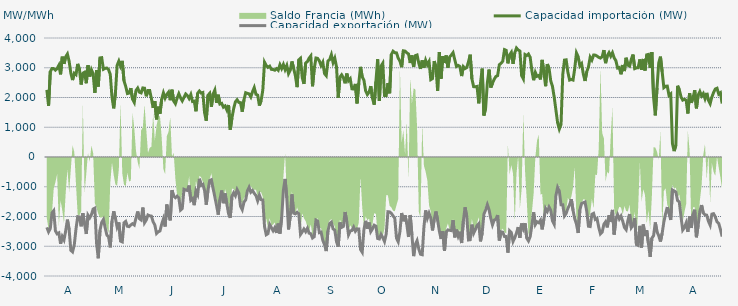
| Category | Capacidad importación (MW) | Capacidad exportación (MW) |
|---|---|---|
| 0 | 2256.625 | -2365.667 |
| 1900-01-01 | 1722.917 | -2515.917 |
| 1900-01-02 | 2869 | -2405.667 |
| 1900-01-03 | 2973.167 | -1879.167 |
| 1900-01-04 | 2971 | -1806.25 |
| 1900-01-05 | 2919.208 | -2484.833 |
| 1900-01-06 | 2973.125 | -2583.917 |
| 1900-01-07 | 3083.25 | -2551.375 |
| 1900-01-08 | 2777.875 | -2917.292 |
| 1900-01-09 | 3371.833 | -2672.292 |
| 1900-01-10 | 3131 | -2785.25 |
| 1900-01-11 | 3368.375 | -2480.958 |
| 1900-01-12 | 3462.292 | -2105.333 |
| 1900-01-13 | 3215.917 | -2442.958 |
| 1900-01-14 | 2817.875 | -3136.917 |
| 1900-01-15 | 2586 | -3188.792 |
| 1900-01-16 | 2815 | -2954.042 |
| 1900-01-17 | 2767 | -2418.75 |
| 1900-01-18 | 3129.208 | -2005 |
| 1900-01-19 | 2953.792 | -2013.417 |
| 1900-01-20 | 2437.083 | -2329.833 |
| 1900-01-21 | 2815.958 | -1889.333 |
| 1900-01-22 | 2849.708 | -2257.667 |
| 1900-01-23 | 2479.208 | -2586.833 |
| 1900-01-24 | 3084.333 | -1954.5 |
| 1900-01-25 | 2707.042 | -2046.583 |
| 1900-01-26 | 2933.542 | -1941.667 |
| 1900-01-27 | 2795.917 | -1750 |
| 1900-01-28 | 2158.042 | -1718.75 |
| 1900-01-29 | 2918.875 | -2898.083 |
| 1900-01-30 | 2368.375 | -3404.167 |
| 1900-01-31 | 3329.75 | -2465.083 |
| 1900-02-01 | 3339.208 | -2197.25 |
| 1900-02-02 | 2948.5 | -2100.583 |
| 1900-02-03 | 2980.792 | -2371.042 |
| 1900-02-04 | 2990.708 | -2620.708 |
| 1900-02-05 | 2938.333 | -2683 |
| 1900-02-06 | 2774.542 | -3036.75 |
| 1900-02-07 | 2014.917 | -2156.292 |
| 1900-02-08 | 1635.417 | -1825.292 |
| 1900-02-09 | 2140.25 | -2060.75 |
| 1900-02-10 | 3080.917 | -2353.125 |
| 1900-02-11 | 3223.333 | -2199.083 |
| 1900-02-12 | 3058.083 | -2827.667 |
| 1900-02-13 | 3231.167 | -2853.292 |
| 1900-02-14 | 2562 | -2213.625 |
| 1900-02-15 | 2375 | -2164.25 |
| 1900-02-16 | 2133.333 | -2329.5 |
| 1900-02-17 | 2150 | -2341.083 |
| 1900-02-18 | 2314.583 | -2282 |
| 1900-02-19 | 1943.75 | -2242.25 |
| 1900-02-20 | 1835.625 | -2285.208 |
| 1900-02-21 | 2235.417 | -2055.542 |
| 1900-02-22 | 2316.667 | -1831.25 |
| 1900-02-23 | 2178.125 | -2071.583 |
| 1900-02-24 | 2154.167 | -2116.125 |
| 1900-02-25 | 2321.417 | -1699.458 |
| 1900-02-26 | 2312 | -2210.167 |
| 1900-02-27 | 2040.917 | -2118.083 |
| 1900-02-28 | 2233.083 | -1949.458 |
| 1900-02-28 | 2234.854 | -1977.083 |
| 1900-03-01 | 1964.583 | -1985.792 |
| 1900-03-02 | 1650 | -2177.417 |
| 1900-03-03 | 1877.083 | -2287.667 |
| 1900-03-04 | 1264.583 | -2568.708 |
| 1900-03-05 | 1691.667 | -2512.667 |
| 1900-03-06 | 1456.25 | -2486.333 |
| 1900-03-07 | 1945.833 | -2259.083 |
| 1900-03-08 | 2154.167 | -2079.5 |
| 1900-03-09 | 1979.167 | -2336.083 |
| 1900-03-10 | 2104.167 | -1597.917 |
| 1900-03-11 | 2179.167 | -1954.167 |
| 1900-03-12 | 1908.333 | -2131.25 |
| 1900-03-13 | 2262.5 | -1118.75 |
| 1900-03-14 | 1879.167 | -1314.583 |
| 1900-03-15 | 1791.667 | -1368 |
| 1900-03-16 | 1977.083 | -1316.667 |
| 1900-03-17 | 2127.083 | -1377.083 |
| 1900-03-18 | 1987.5 | -1785.417 |
| 1900-03-19 | 1887.5 | -1733.333 |
| 1900-03-20 | 2002.083 | -1085.417 |
| 1900-03-21 | 2118.75 | -1110.417 |
| 1900-03-22 | 2066.667 | -1125 |
| 1900-03-23 | 1966.667 | -958.333 |
| 1900-03-24 | 2097.917 | -1454.167 |
| 1900-03-25 | 1864.583 | -1397.917 |
| 1900-03-26 | 1877.083 | -1618.75 |
| 1900-03-27 | 1537.5 | -1143.75 |
| 1900-03-28 | 2145.833 | -1264 |
| 1900-03-29 | 2216.667 | -731.25 |
| 1900-03-30 | 2150 | -950 |
| 1900-03-31 | 2167.583 | -916.667 |
| 1900-04-01 | 1493.75 | -1122.25 |
| 1900-04-02 | 1220.833 | -1604.167 |
| 1900-04-03 | 2072.917 | -1125 |
| 1900-04-04 | 2139.583 | -791.667 |
| 1900-04-05 | 1687.5 | -764.583 |
| 1900-04-06 | 2116.667 | -1058.333 |
| 1900-04-07 | 2247.917 | -1337.5 |
| 1900-04-08 | 1818.75 | -1627.083 |
| 1900-04-09 | 2093.75 | -1937.5 |
| 1900-04-10 | 1781.25 | -1422.917 |
| 1900-04-11 | 1804.167 | -1127.083 |
| 1900-04-12 | 1675 | -1552.083 |
| 1900-04-13 | 1716.667 | -1225 |
| 1900-04-14 | 1583.333 | -1570.833 |
| 1900-04-15 | 1747.917 | -1904.167 |
| 1900-04-16 | 918.75 | -2042.875 |
| 1900-04-17 | 1314.583 | -1310.417 |
| 1900-04-18 | 1629.167 | -1200 |
| 1900-04-19 | 1852.083 | -1300.583 |
| 1900-04-20 | 1925 | -1095.833 |
| 1900-04-21 | 1835.417 | -1208.333 |
| 1900-04-22 | 1827.083 | -1656.25 |
| 1900-04-23 | 1522.917 | -1770.917 |
| 1900-04-24 | 1916.667 | -1518.75 |
| 1900-04-25 | 2160.417 | -1441.667 |
| 1900-04-26 | 2139.583 | -1137.5 |
| 1900-04-27 | 2120.833 | -1018.75 |
| 1900-04-28 | 2018.75 | -1183.333 |
| 1900-04-29 | 2193.75 | -1127.083 |
| 1900-04-30 | 2333.333 | -1220.833 |
| 1900-05-01 | 2108.333 | -1295.833 |
| 1900-05-02 | 2079.833 | -1472.917 |
| 1900-05-03 | 1729.167 | -1281.25 |
| 1900-05-04 | 1897.917 | -1434.542 |
| 1900-05-05 | 2247 | -1443.75 |
| 1900-05-06 | 3185.083 | -2337 |
| 1900-05-07 | 3075.167 | -2613.625 |
| 1900-05-08 | 3013.625 | -2576.5 |
| 1900-05-09 | 3052.042 | -2269.25 |
| 1900-05-10 | 2946.333 | -2370.833 |
| 1900-05-11 | 2940.542 | -2478.958 |
| 1900-05-12 | 2917.208 | -2375.625 |
| 1900-05-13 | 2971.167 | -2551.875 |
| 1900-05-14 | 2917.292 | -2238 |
| 1900-05-15 | 3101.958 | -2573.167 |
| 1900-05-16 | 2973.375 | -2041.667 |
| 1900-05-17 | 3109.875 | -1120.167 |
| 1900-05-18 | 2936.333 | -737.5 |
| 1900-05-19 | 3074.833 | -1371.667 |
| 1900-05-20 | 2802.417 | -2434.917 |
| 1900-05-21 | 2913.625 | -1996.875 |
| 1900-05-22 | 3212.125 | -1254.167 |
| 1900-05-23 | 2973 | -1887.5 |
| 1900-05-24 | 2732 | -1910.417 |
| 1900-05-25 | 2348.333 | -1858 |
| 1900-05-26 | 3266 | -1911.25 |
| 1900-05-27 | 3318.417 | -2603.917 |
| 1900-05-28 | 2666.292 | -2519.292 |
| 1900-05-29 | 2457.667 | -2420.375 |
| 1900-05-30 | 3159.917 | -2510.583 |
| 1900-05-31 | 3208.208 | -2395.833 |
| 1900-06-01 | 3322.042 | -2559.25 |
| 1900-06-02 | 3397.292 | -2579.208 |
| 1900-06-03 | 2377.292 | -2722 |
| 1900-06-04 | 2966.875 | -2678.583 |
| 1900-06-05 | 3327.583 | -2120.833 |
| 1900-06-06 | 3314.125 | -2154.167 |
| 1900-06-07 | 3229.625 | -2542.417 |
| 1900-06-08 | 3075.125 | -2524.125 |
| 1900-06-09 | 3186.833 | -2800.875 |
| 1900-06-10 | 2804.417 | -2944.208 |
| 1900-06-11 | 2733.75 | -3162.5 |
| 1900-06-12 | 3225.458 | -2491.042 |
| 1900-06-13 | 3275.667 | -2238.417 |
| 1900-06-14 | 3439.5 | -2190.417 |
| 1900-06-15 | 3175.292 | -2417.375 |
| 1900-06-16 | 3321.875 | -2458.417 |
| 1900-06-17 | 3034.917 | -2846.167 |
| 1900-06-18 | 1991.917 | -3010.667 |
| 1900-06-19 | 2685.833 | -2200.25 |
| 1900-06-20 | 2763.167 | -2365.208 |
| 1900-06-21 | 2664.875 | -2334.375 |
| 1900-06-22 | 2477.792 | -1849.417 |
| 1900-06-23 | 2804.25 | -2175.083 |
| 1900-06-24 | 2563.458 | -2614.833 |
| 1900-06-25 | 2629.917 | -2484.333 |
| 1900-06-26 | 2292 | -2469.792 |
| 1900-06-27 | 2284.542 | -2356.917 |
| 1900-06-28 | 2456.5 | -2494.792 |
| 1900-06-29 | 1801.792 | -2413.833 |
| 1900-06-30 | 2484.917 | -2419 |
| 1900-07-01 | 3029.417 | -3108.292 |
| 1900-07-02 | 2693.417 | -3201.125 |
| 1900-07-03 | 2579.5 | -2439 |
| 1900-07-04 | 2220.833 | -2146.167 |
| 1900-07-05 | 2100 | -2410.292 |
| 1900-07-06 | 2179.167 | -2202.083 |
| 1900-07-07 | 2381.25 | -2508.5 |
| 1900-07-08 | 1970.833 | -2414.375 |
| 1900-07-09 | 1758.333 | -2292.792 |
| 1900-07-10 | 2544 | -2324.083 |
| 1900-07-11 | 3285.125 | -2739.75 |
| 1900-07-12 | 1885.375 | -2754.917 |
| 1900-07-13 | 3057.958 | -2601 |
| 1900-07-14 | 3152.583 | -2708.375 |
| 1900-07-15 | 2068.833 | -2840.833 |
| 1900-07-16 | 2060.917 | -2586.417 |
| 1900-07-17 | 2484.25 | -1839.417 |
| 1900-07-18 | 2141.208 | -1845.833 |
| 1900-07-19 | 3445.375 | -1893.75 |
| 1900-07-20 | 3555.25 | -1979.583 |
| 1900-07-21 | 3506.875 | -2054.167 |
| 1900-07-22 | 3499.292 | -2730 |
| 1900-07-23 | 3321.917 | -2848.375 |
| 1900-07-24 | 3225.583 | -2505.583 |
| 1900-07-25 | 3019.583 | -1882.958 |
| 1900-07-26 | 3568.667 | -2157.833 |
| 1900-07-27 | 3559.375 | -1957.75 |
| 1900-07-28 | 3503.125 | -2252.375 |
| 1900-07-29 | 3464.458 | -2689.458 |
| 1900-07-30 | 3159.52 | -1949.52 |
| 1900-07-31 | 3414.875 | -2624.75 |
| 1900-08-01 | 3028.417 | -3331.875 |
| 1900-08-02 | 3406.833 | -2936.5 |
| 1900-08-03 | 3428.875 | -2811.25 |
| 1900-08-04 | 3154.208 | -3088.625 |
| 1900-08-05 | 2961.542 | -3268.083 |
| 1900-08-06 | 3246.75 | -3285.125 |
| 1900-08-07 | 2998.792 | -2359.333 |
| 1900-08-08 | 3250.625 | -1795.833 |
| 1900-08-09 | 3098.083 | -2058.458 |
| 1900-08-10 | 3208.458 | -1889.583 |
| 1900-08-11 | 2600.833 | -2050 |
| 1900-08-12 | 2636.458 | -2468.208 |
| 1900-08-13 | 3221.75 | -2100 |
| 1900-08-14 | 3030.917 | -1831.25 |
| 1900-08-15 | 2221.417 | -2127.083 |
| 1900-08-16 | 3529.833 | -2490.5 |
| 1900-08-17 | 2631.583 | -2756.25 |
| 1900-08-18 | 3389.417 | -2493.667 |
| 1900-08-19 | 3161.917 | -3158.375 |
| 1900-08-20 | 3412.417 | -2518.792 |
| 1900-08-21 | 3004.917 | -2450.333 |
| 1900-08-22 | 3360.75 | -2463.25 |
| 1900-08-23 | 3427.958 | -2474.292 |
| 1900-08-24 | 3506.917 | -2123.5 |
| 1900-08-25 | 3269.708 | -2701.708 |
| 1900-08-26 | 3043.333 | -2440.417 |
| 1900-08-27 | 3078.833 | -2660.667 |
| 1900-08-28 | 3042.542 | -2510.25 |
| 1900-08-29 | 2720.083 | -2892.208 |
| 1900-08-30 | 3035.792 | -2156.833 |
| 1900-08-31 | 2973.125 | -1691.667 |
| 1900-09-01 | 3008.708 | -2006.25 |
| 1900-09-02 | 3198.417 | -2788.271 |
| 1900-09-03 | 3439.5 | -2780.875 |
| 1900-09-04 | 2626.625 | -2273 |
| 1900-09-05 | 2364.583 | -2564.167 |
| 1900-09-06 | 2360.417 | -2440.708 |
| 1900-09-07 | 2372.917 | -2302.125 |
| 1900-09-08 | 1804.167 | -2241.25 |
| 1900-09-09 | 2476.875 | -2836.292 |
| 1900-09-10 | 2972.208 | -2552.292 |
| 1900-09-11 | 1394.917 | -1922 |
| 1900-09-12 | 1635.417 | -1780.667 |
| 1900-09-13 | 2487.208 | -1602.083 |
| 1900-09-14 | 2938.333 | -1770.833 |
| 1900-09-15 | 2333.708 | -2058.75 |
| 1900-09-16 | 2480.333 | -2280.5 |
| 1900-09-17 | 2612.458 | -2120.333 |
| 1900-09-18 | 2705.792 | -2095.25 |
| 1900-09-19 | 2735.375 | -1951.833 |
| 1900-09-20 | 3100.375 | -2807.583 |
| 1900-09-21 | 3154.125 | -2514.417 |
| 1900-09-22 | 3216.042 | -2530.208 |
| 1900-09-23 | 3609.167 | -2672.875 |
| 1900-09-24 | 3585.958 | -2674.5 |
| 1900-09-25 | 3148.417 | -3214.25 |
| 1900-09-26 | 3433.542 | -2480.667 |
| 1900-09-27 | 3518.5 | -2539.5 |
| 1900-09-28 | 3130.292 | -2838.583 |
| 1900-09-29 | 3499.167 | -2718.417 |
| 1900-09-30 | 3663.042 | -2554.083 |
| 1900-10-01 | 3596.708 | -2355.75 |
| 1900-10-02 | 3562.792 | -2716.417 |
| 1900-10-03 | 2738.75 | -2235.333 |
| 1900-10-04 | 2625.667 | -2410 |
| 1900-10-05 | 3444.083 | -2226.333 |
| 1900-10-06 | 3408.75 | -2728 |
| 1900-10-07 | 3460.583 | -2820.25 |
| 1900-10-08 | 3350.75 | -2676.083 |
| 1900-10-09 | 2899.917 | -2289.583 |
| 1900-10-10 | 2581.708 | -1858.083 |
| 1900-10-11 | 2842.042 | -2272.417 |
| 1900-10-12 | 2711.125 | -2177.417 |
| 1900-10-13 | 2740.458 | -2209.667 |
| 1900-10-14 | 2608.583 | -2127.083 |
| 1900-10-15 | 3264.042 | -2433.083 |
| 1900-10-16 | 2836.375 | -2085.417 |
| 1900-10-17 | 2379.792 | -1727.083 |
| 1900-10-18 | 3123.25 | -1827.083 |
| 1900-10-19 | 2982.792 | -1681.25 |
| 1900-10-20 | 2556.667 | -1789.667 |
| 1900-10-21 | 2375.667 | -2149.333 |
| 1900-10-22 | 2017.208 | -2261.458 |
| 1900-10-23 | 1585 | -1297.917 |
| 1900-10-24 | 1154.167 | -1022.917 |
| 1900-10-25 | 939.583 | -1143.75 |
| 1900-10-26 | 1093.75 | -1604.167 |
| 1900-10-27 | 2763.333 | -1604.167 |
| 1900-10-28 | 3256.375 | -1980.875 |
| 1900-10-29 | 3265.958 | -1897.917 |
| 1900-10-30 | 2849.625 | -1726.333 |
| 1900-10-31 | 2586.542 | -1614.583 |
| 1900-11-01 | 2607.375 | -1416.667 |
| 1900-11-02 | 2587.208 | -1789.583 |
| 1900-11-03 | 2978.5 | -2081.25 |
| 1900-11-04 | 3497.083 | -2256.292 |
| 1900-11-05 | 3370 | -2554.542 |
| 1900-11-06 | 3061.75 | -1771.917 |
| 1900-11-07 | 3134.875 | -1562.5 |
| 1900-11-08 | 2789.5 | -1537.5 |
| 1900-11-09 | 2555.75 | -1512.5 |
| 1900-11-10 | 2867.083 | -1825 |
| 1900-11-11 | 3026.833 | -2326.458 |
| 1900-11-12 | 3354.833 | -2337.292 |
| 1900-11-13 | 3258.292 | -1924.167 |
| 1900-11-14 | 3426.125 | -1893.75 |
| 1900-11-15 | 3424.167 | -2100 |
| 1900-11-16 | 3391.208 | -2070.833 |
| 1900-11-17 | 3348.208 | -2362.208 |
| 1900-11-18 | 3325.958 | -2584.917 |
| 1900-11-19 | 3372.292 | -2526.125 |
| 1900-11-20 | 3594.458 | -2261.833 |
| 1900-11-21 | 3154.208 | -2177.542 |
| 1900-11-22 | 3406.542 | -2366 |
| 1900-11-23 | 3506.792 | -1962 |
| 1900-11-24 | 3388.292 | -2170.833 |
| 1900-11-25 | 3502.625 | -1778.917 |
| 1900-11-26 | 3329.875 | -2606.583 |
| 1900-11-27 | 3238.958 | -2081.917 |
| 1900-11-28 | 2990.542 | -1937.25 |
| 1900-11-29 | 3009.542 | -2084.208 |
| 1900-11-30 | 2780.333 | -1987.25 |
| 1900-12-01 | 3090.792 | -2157.25 |
| 1900-12-02 | 2889.375 | -2369.167 |
| 1900-12-03 | 3335.375 | -2443.917 |
| 1900-12-04 | 3086.625 | -2135.417 |
| 1900-12-05 | 3054 | -1916.417 |
| 1900-12-06 | 3285.417 | -2373 |
| 1900-12-07 | 3443.292 | -2289.333 |
| 1900-12-08 | 2971.208 | -2047.917 |
| 1900-12-09 | 2996.292 | -2944.458 |
| 1900-12-10 | 3001.167 | -2971.542 |
| 1900-12-11 | 3281.375 | -2314.833 |
| 1900-12-12 | 2936.042 | -3043.167 |
| 1900-12-13 | 3294.792 | -2270.333 |
| 1900-12-14 | 2907.375 | -2657.667 |
| 1900-12-15 | 3433.583 | -2462.5 |
| 1900-12-16 | 3449.042 | -2914.583 |
| 1900-12-17 | 2992.458 | -3358.458 |
| 1900-12-18 | 3524.375 | -2728.208 |
| 1900-12-19 | 2000 | -2643.375 |
| 1900-12-20 | 1400 | -2200 |
| 1900-12-21 | 2323.375 | -2514.75 |
| 1900-12-22 | 3160.167 | -2645.333 |
| 1900-12-23 | 3372.083 | -2842.167 |
| 1900-12-24 | 2865.739 | -2564.565 |
| 1900-12-25 | 2332.667 | -2181.833 |
| 1900-12-26 | 2376.083 | -1906.25 |
| 1900-12-27 | 2381.25 | -1683.333 |
| 1900-12-28 | 2070.833 | -1891.667 |
| 1900-12-29 | 2120.083 | -2118.75 |
| 1900-12-30 | 449.25 | -1108.333 |
| 1900-12-31 | 200 | -1139.583 |
| 1901-01-01 | 395.833 | -1179.167 |
| 1901-01-02 | 2393.75 | -1462.5 |
| 1901-01-03 | 2262.25 | -1512.5 |
| 1901-01-04 | 2020.833 | -2007.167 |
| 1901-01-05 | 1912.5 | -2455.208 |
| 1901-01-06 | 1939.583 | -2371.125 |
| 1901-01-07 | 1908.333 | -2217.958 |
| 1901-01-08 | 1462.5 | -2517.542 |
| 1901-01-09 | 2145.208 | -2000.417 |
| 1901-01-10 | 1820.833 | -2386.167 |
| 1901-01-11 | 1983.333 | -1930.75 |
| 1901-01-12 | 2245.833 | -1772.917 |
| 1901-01-13 | 1635.417 | -2697.5 |
| 1901-01-14 | 2079.167 | -2299.625 |
| 1901-01-15 | 2200 | -1818.75 |
| 1901-01-16 | 2052.083 | -1616.667 |
| 1901-01-17 | 2133.333 | -1885.417 |
| 1901-01-18 | 1962.5 | -1940.792 |
| 1901-01-19 | 2154.167 | -1955.875 |
| 1901-01-20 | 1906.25 | -2160.458 |
| 1901-01-21 | 1791.667 | -2289.583 |
| 1901-01-22 | 2014.583 | -1920.333 |
| 1901-01-23 | 2166.667 | -1904.167 |
| 1901-01-24 | 2285.417 | -2016.25 |
| 1901-01-25 | 2310.417 | -2177.917 |
| 1901-01-26 | 2114.583 | -2230.875 |
| 1901-01-27 | 2160.417 | -2431.625 |
| 1901-01-28 | 1797.917 | -2674.417 |